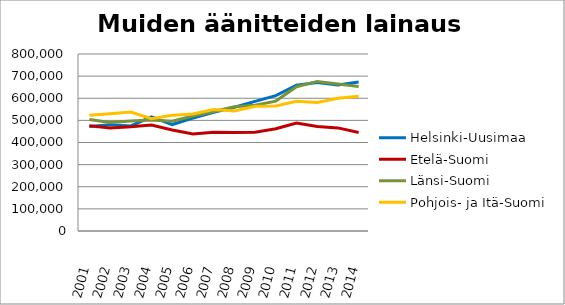
| Category | Helsinki-Uusimaa | Etelä-Suomi | Länsi-Suomi | Pohjois- ja Itä-Suomi |
|---|---|---|---|---|
| 2001.0 | 472368 | 476175 | 503989 | 522977 |
| 2002.0 | 480563 | 465440 | 490369 | 529613 |
| 2003.0 | 475050 | 470803 | 497578 | 537945 |
| 2004.0 | 515420 | 479333 | 501188 | 507498 |
| 2005.0 | 481136 | 456679 | 496019 | 523612 |
| 2006.0 | 509875 | 438677 | 519922 | 528758 |
| 2007.0 | 536465 | 446854 | 540141 | 549394 |
| 2008.0 | 559034 | 444823 | 561512 | 542628 |
| 2009.0 | 585921 | 446396 | 568150 | 563717 |
| 2010.0 | 611997 | 462101 | 587105 | 565112 |
| 2011.0 | 658647 | 488058 | 651960 | 585893 |
| 2012.0 | 671662 | 472165 | 676089 | 580923 |
| 2013.0 | 660087 | 466010 | 663975 | 600264 |
| 2014.0 | 673158 | 445097 | 652792 | 608681 |